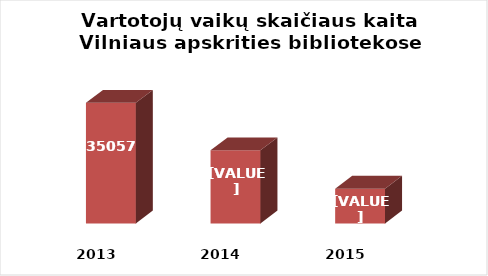
| Category | Series 0 |
|---|---|
| 2013.0 | 35057 |
| 2014.0 | 32277 |
| 2015.0 | 30032 |